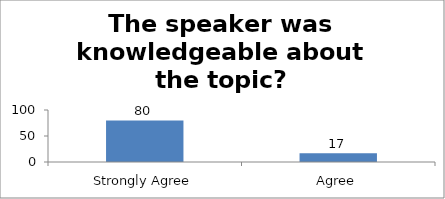
| Category | The speaker was knowledgeable about the topic? |
|---|---|
| Strongly Agree | 80 |
| Agree | 17 |